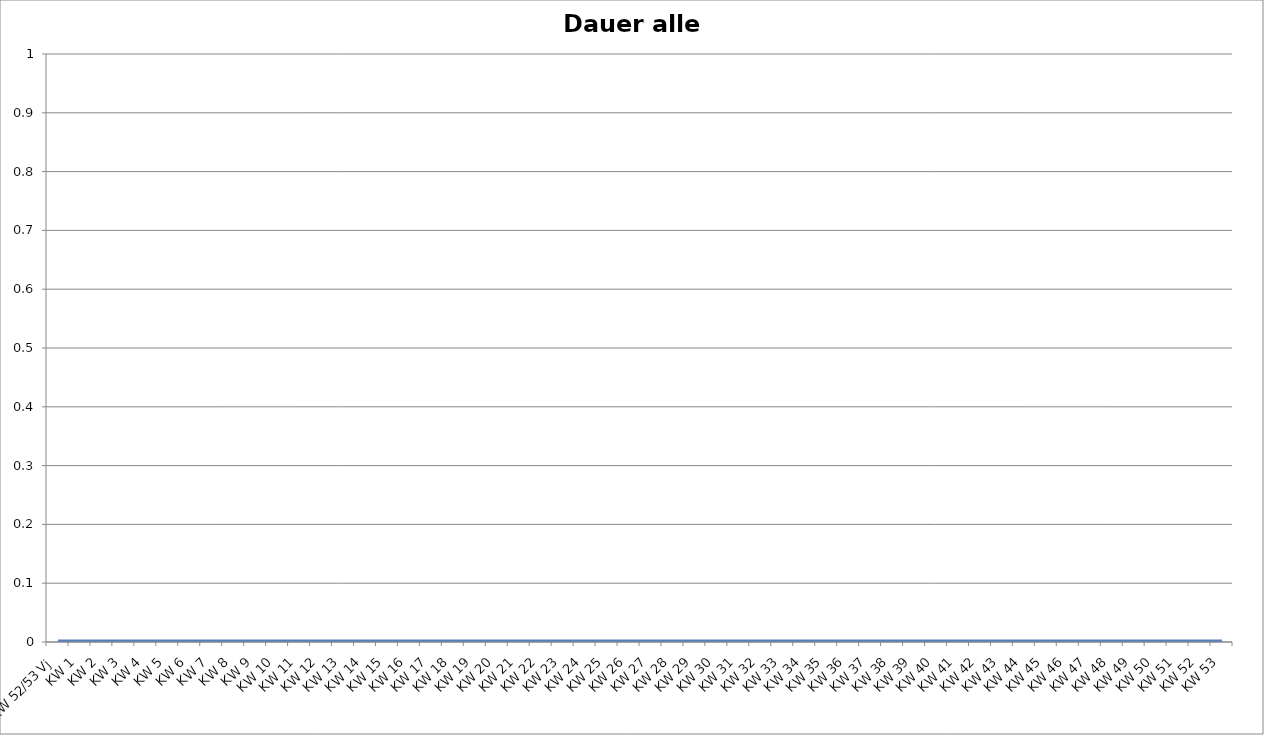
| Category | Dauer |
|---|---|
| KW 52/53 Vj | 0 |
| KW 1 | 0 |
| KW 2 | 0 |
| KW 3 | 0 |
| KW 4 | 0 |
| KW 5 | 0 |
| KW 6 | 0 |
| KW 7 | 0 |
| KW 8 | 0 |
| KW 9 | 0 |
| KW 10 | 0 |
| KW 11 | 0 |
| KW 12 | 0 |
| KW 13 | 0 |
| KW 14 | 0 |
| KW 15 | 0 |
| KW 16 | 0 |
| KW 17 | 0 |
| KW 18 | 0 |
| KW 19 | 0 |
| KW 20 | 0 |
| KW 21 | 0 |
| KW 22 | 0 |
| KW 23 | 0 |
| KW 24 | 0 |
| KW 25 | 0 |
| KW 26 | 0 |
| KW 27 | 0 |
| KW 28 | 0 |
| KW 29 | 0 |
| KW 30 | 0 |
| KW 31 | 0 |
| KW 32 | 0 |
| KW 33 | 0 |
| KW 34 | 0 |
| KW 35 | 0 |
| KW 36 | 0 |
| KW 37 | 0 |
| KW 38 | 0 |
| KW 39 | 0 |
| KW 40 | 0 |
| KW 41 | 0 |
| KW 42 | 0 |
| KW 43 | 0 |
| KW 44 | 0 |
| KW 45 | 0 |
| KW 46 | 0 |
| KW 47 | 0 |
| KW 48 | 0 |
| KW 49 | 0 |
| KW 50 | 0 |
| KW 51 | 0 |
| KW 52 | 0 |
| KW 53 | 0 |